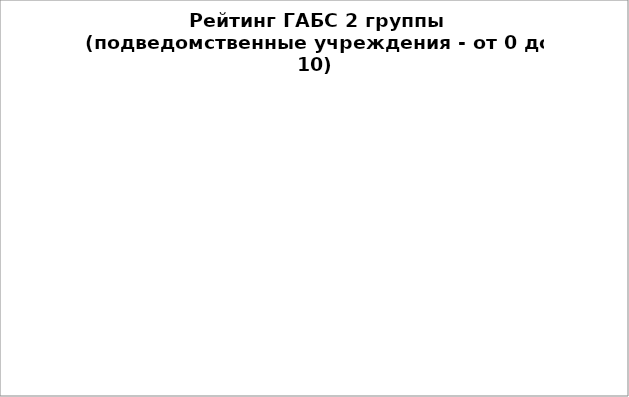
| Category | Series 0 |
|---|---|
| Управление делами Администрации города Омска | 99.048 |
| Департамент имущественных отношений Администрации города Омска | 97.899 |
| Департамент архитектуры и градостроительства Администрации города Омска | 97.768 |
| Департамент жилищной политики Администрации города Омска | 93.762 |
| Департамент городского хозяйства Администрации города Омска | 91.479 |